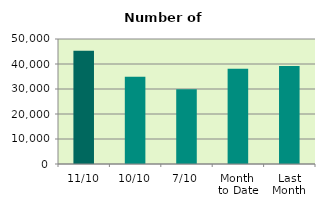
| Category | Series 0 |
|---|---|
| 11/10 | 45252 |
| 10/10 | 34874 |
| 7/10 | 29904 |
| Month 
to Date | 38070.286 |
| Last
Month | 39229.818 |